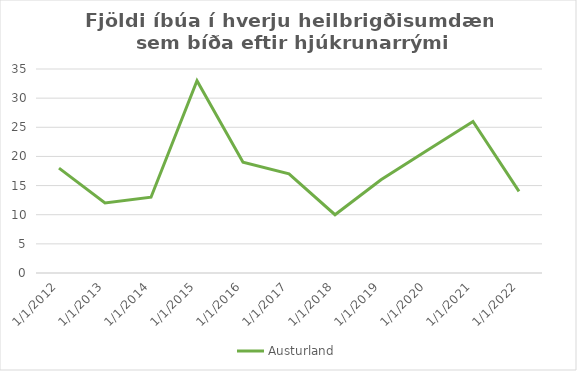
| Category | Austurland |
|---|---|
| 1/1/12 | 18 |
| 1/1/13 | 12 |
| 1/1/14 | 13 |
| 1/1/15 | 33 |
| 1/1/16 | 19 |
| 1/1/17 | 17 |
| 1/1/18 | 10 |
| 1/1/19 | 16 |
| 1/1/20 | 21 |
| 1/1/21 | 26 |
| 1/1/22 | 14 |